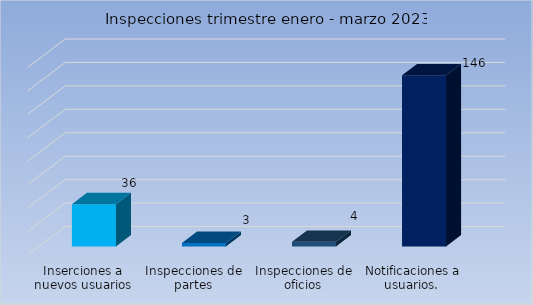
| Category | Cantidad |
|---|---|
| Inserciones a nuevos usuarios | 36 |
| Inspecciones de partes | 3 |
| Inspecciones de oficios | 4 |
| Notificaciones a usuarios.  | 146 |